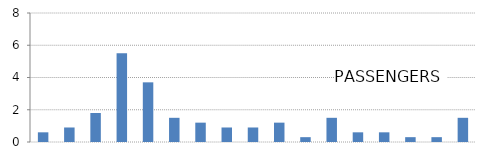
| Category | PASSENGERS |
|---|---|
| 0-4  | 0.6 |
| 5-9 | 0.9 |
| 10-14 | 1.8 |
| 15-19  | 5.5 |
| 20-24  | 3.7 |
| 25-29  | 1.5 |
| 30-34  | 1.2 |
| 35-39  | 0.9 |
| 40-44  | 0.9 |
| 45-49  | 1.2 |
| 50-54  | 0.3 |
| 55-59  | 1.5 |
| 60-64  | 0.6 |
| 65-69  | 0.6 |
| 70-74  | 0.3 |
| 75-79  | 0.3 |
| 80+ | 1.5 |